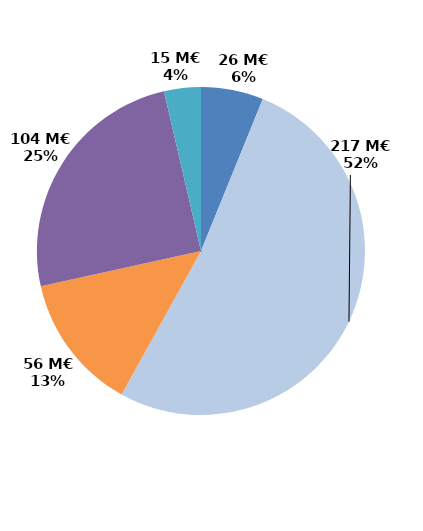
| Category | Series 0 |
|---|---|
| Contrats aidés marchand (hors IAE) | 25.685 |
| Contrats aidés non marchand (hors IAE) | 216.708 |
| Insertion par l'activité économique | 56.362 |
| Mesures en faveur des handicapés | 103.685 |
| Autres emplois aidés | 15.142 |